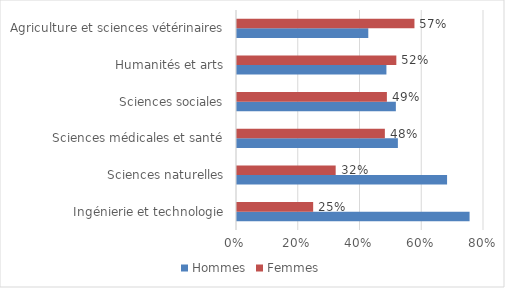
| Category | Hommes | Femmes |
|---|---|---|
| Ingénierie et technologie | 0.753 | 0.247 |
| Sciences naturelles | 0.68 | 0.32 |
| Sciences médicales et santé | 0.521 | 0.479 |
| Sciences sociales | 0.515 | 0.485 |
| Humanités et arts | 0.484 | 0.516 |
| Agriculture et sciences vétérinaires | 0.425 | 0.575 |